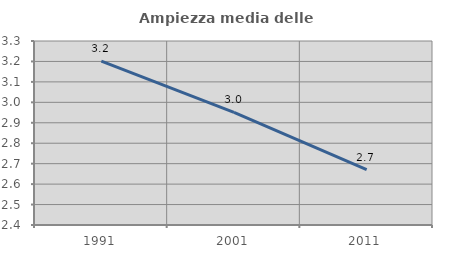
| Category | Ampiezza media delle famiglie |
|---|---|
| 1991.0 | 3.201 |
| 2001.0 | 2.951 |
| 2011.0 | 2.671 |